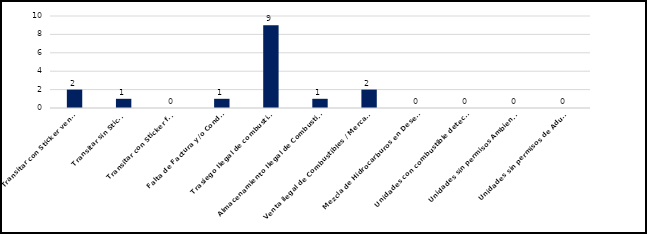
| Category | Series 0 |
|---|---|
| Transitar con Sticker vencido | 2 |
| Transitar sin Sticker | 1 |
| Transitar con Sticker falso | 0 |
| Falta de Factura y/o Conduce | 1 |
| Trasiego Ilegal de combustibles  | 9 |
| Almacenamiento Ilegal de Combustibles  | 1 |
| Venta ilegal de Combustibles / Mercancías | 2 |
| Mezcla de Hidrocarburos en Desechos | 0 |
| Unidades con combustible detectado  | 0 |
| Unidades sin permisos Ambientales | 0 |
| Unidades sin permisos de Aduanas  | 0 |